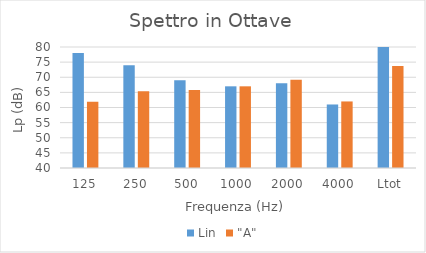
| Category | Lin | "A" |
|---|---|---|
| 125 | 78 | 61.9 |
| 250 | 74 | 65.4 |
| 500 | 69 | 65.8 |
| 1000 | 67 | 67 |
| 2000 | 68 | 69.2 |
| 4000 | 61 | 62 |
| Ltot | 80.364 | 73.753 |